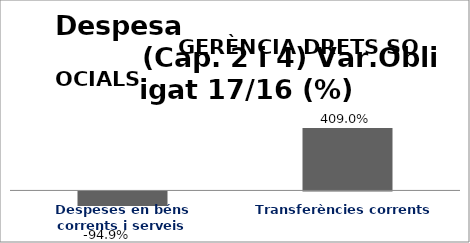
| Category | Series 0 |
|---|---|
| Despeses en béns corrents i serveis | -0.949 |
| Transferències corrents | 4.09 |